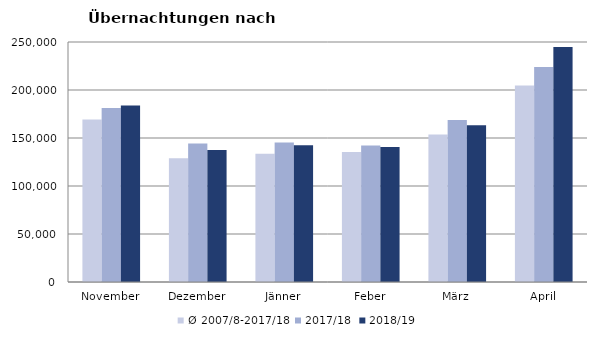
| Category | Ø 2007/8-2017/18 | 2017/18 | 2018/19 |
|---|---|---|---|
| November | 169174.091 | 181241 | 183958 |
| Dezember | 128849.545 | 144168 | 137414 |
| Jänner | 133615.364 | 145246 | 142561 |
| Feber | 135302.455 | 142295 | 140588 |
| März | 153629 | 168732 | 163253 |
| April | 204805.273 | 224025 | 244822 |